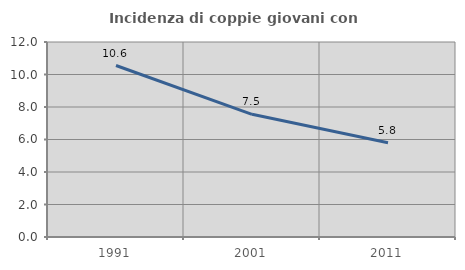
| Category | Incidenza di coppie giovani con figli |
|---|---|
| 1991.0 | 10.552 |
| 2001.0 | 7.549 |
| 2011.0 | 5.797 |